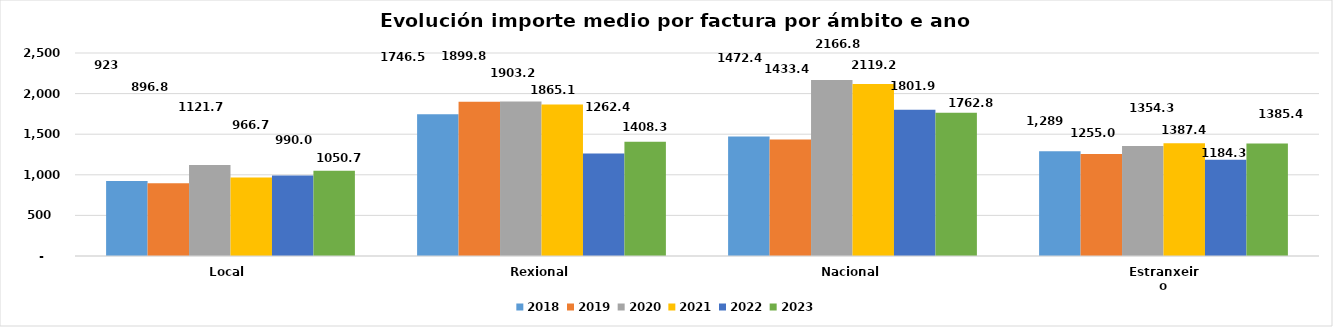
| Category | 2018 | 2019 | 2020 | 2021 | 2022 | 2023 |
|---|---|---|---|---|---|---|
| Local  | 922.872 | 896.839 | 1121.752 | 966.74 | 990.041 | 1050.765 |
| Rexional | 1746.574 | 1899.826 | 1903.213 | 1865.11 | 1262.469 | 1408.324 |
| Nacional | 1472.454 | 1433.465 | 2166.887 | 2119.28 | 1801.943 | 1762.799 |
| Estranxeiro | 1288.617 | 1255.048 | 1354.307 | 1387.4 | 1184.344 | 1385.419 |